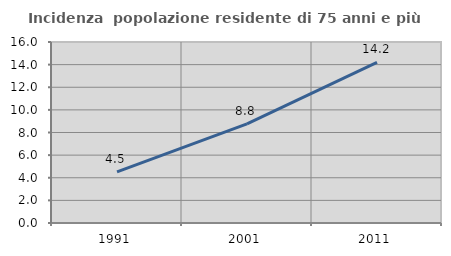
| Category | Incidenza  popolazione residente di 75 anni e più |
|---|---|
| 1991.0 | 4.523 |
| 2001.0 | 8.758 |
| 2011.0 | 14.198 |